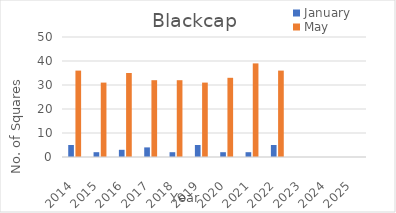
| Category | January | May |
|---|---|---|
| 2014.0 | 5 | 36 |
| 2015.0 | 2 | 31 |
| 2016.0 | 3 | 35 |
| 2017.0 | 4 | 32 |
| 2018.0 | 2 | 32 |
| 2019.0 | 5 | 31 |
| 2020.0 | 2 | 33 |
| 2021.0 | 2 | 39 |
| 2022.0 | 5 | 36 |
| 2023.0 | 0 | 0 |
| 2024.0 | 0 | 0 |
| 2025.0 | 0 | 0 |